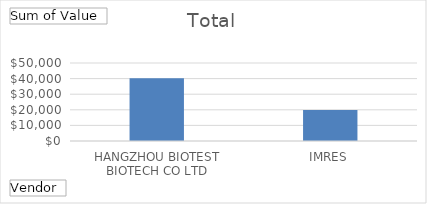
| Category | Total |
|---|---|
| HANGZHOU BIOTEST BIOTECH CO LTD | 40180 |
| IMRES | 19825.16 |